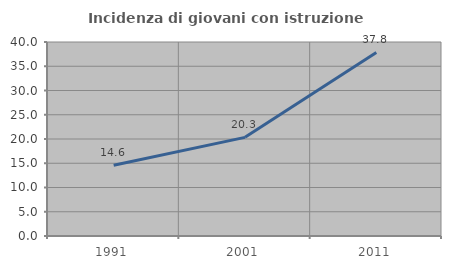
| Category | Incidenza di giovani con istruzione universitaria |
|---|---|
| 1991.0 | 14.583 |
| 2001.0 | 20.339 |
| 2011.0 | 37.838 |